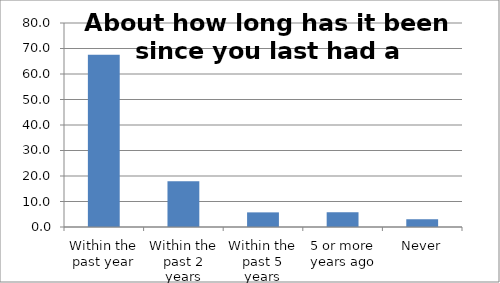
| Category | Series 0 |
|---|---|
| Within the past year | 67.573 |
| Within the past 2 years | 17.893 |
| Within the past 5 years | 5.736 |
| 5 or more years ago | 5.753 |
| Never | 3.045 |